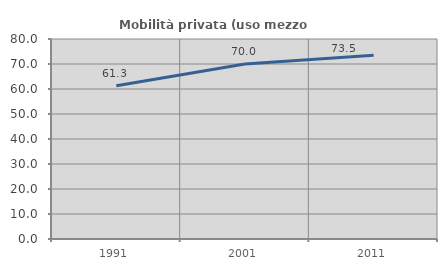
| Category | Mobilità privata (uso mezzo privato) |
|---|---|
| 1991.0 | 61.265 |
| 2001.0 | 70.019 |
| 2011.0 | 73.529 |